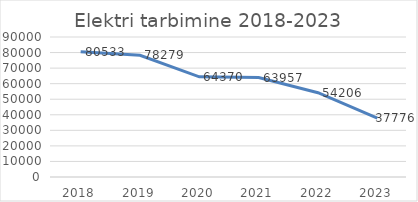
| Category | Series 0 |
|---|---|
| 2018.0 | 80533 |
| 2019.0 | 78279 |
| 2020.0 | 64370 |
| 2021.0 | 63957 |
| 2022.0 | 54206 |
| 2023.0 | 37776 |